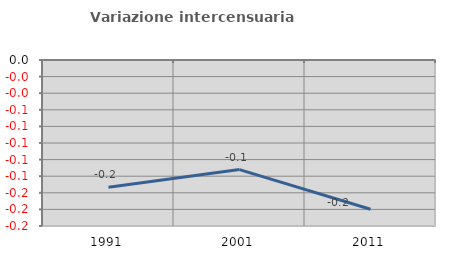
| Category | Variazione intercensuaria annua |
|---|---|
| 1991.0 | -0.153 |
| 2001.0 | -0.132 |
| 2011.0 | -0.18 |